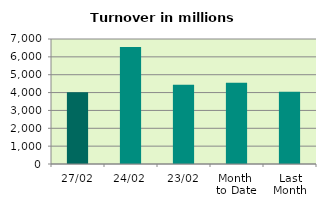
| Category | Series 0 |
|---|---|
| 27/02 | 4012.546 |
| 24/02 | 6547.126 |
| 23/02 | 4440.866 |
| Month 
to Date | 4545.394 |
| Last
Month | 4043.095 |